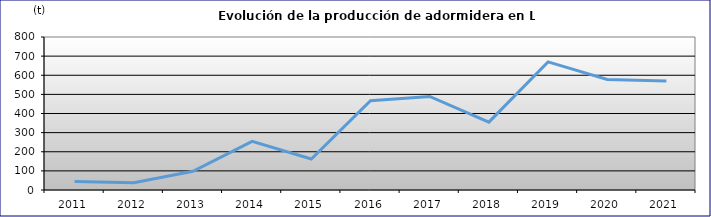
| Category | PRODUCCIÓN  (t) |
|---|---|
| 2011.0 | 44 |
| 2012.0 | 38 |
| 2013.0 | 98 |
| 2014.0 | 254 |
| 2015.0 | 162 |
| 2016.0 | 467 |
| 2017.0 | 489 |
| 2018.0 | 355 |
| 2019.0 | 670 |
| 2020.0 | 578 |
| 2021.0 | 570 |